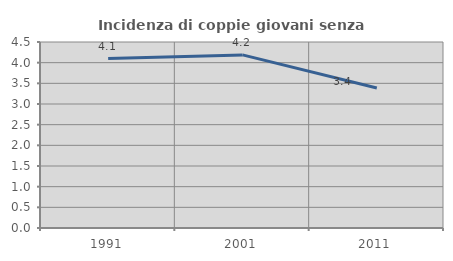
| Category | Incidenza di coppie giovani senza figli |
|---|---|
| 1991.0 | 4.098 |
| 2001.0 | 4.188 |
| 2011.0 | 3.385 |